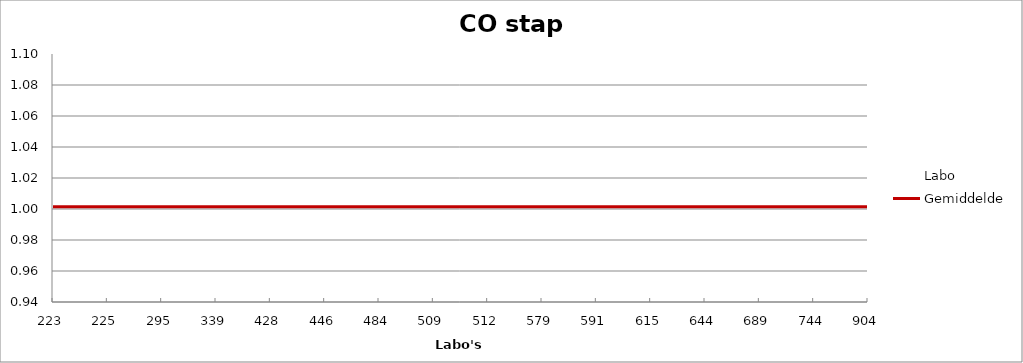
| Category | Labo | Gemiddelde |
|---|---|---|
| 223.0 | 0.981 | 1.001 |
| 225.0 | 1.009 | 1.001 |
| 295.0 | 0.973 | 1.001 |
| 339.0 | 1.038 | 1.001 |
| 428.0 | 1.009 | 1.001 |
| 446.0 | 0.995 | 1.001 |
| 484.0 | 0.995 | 1.001 |
| 509.0 | 1.024 | 1.001 |
| 512.0 | 0.966 | 1.001 |
| 579.0 | 1.038 | 1.001 |
| 591.0 | 0.966 | 1.001 |
| 615.0 | 0.981 | 1.001 |
| 644.0 | 1.096 | 1.001 |
| 689.0 | 0.995 | 1.001 |
| 744.0 | 1.009 | 1.001 |
| 904.0 | 1.002 | 1.001 |